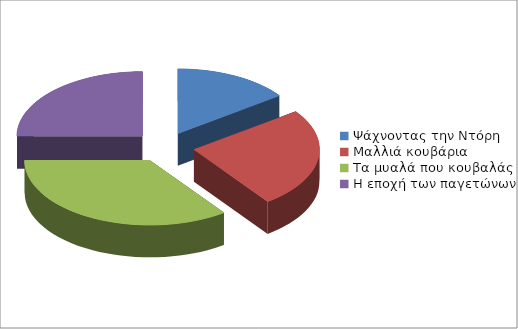
| Category | Series 0 |
|---|---|
| Ψάχνοντας την Ντόρη | 3 |
| Μαλλιά κουβάρια | 5 |
| Τα μυαλά που κουβαλάς | 7 |
| Η εποχή των παγετώνων | 5 |